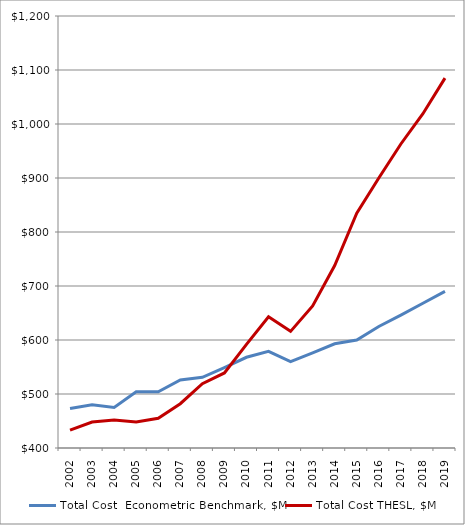
| Category | Total Cost  Econometric Benchmark, $M | Total Cost THESL, $M |
|---|---|---|
| 2002.0 | 473 | 433 |
| 2003.0 | 480 | 448 |
| 2004.0 | 475 | 452 |
| 2005.0 | 504 | 448 |
| 2006.0 | 504 | 455 |
| 2007.0 | 526 | 482 |
| 2008.0 | 531 | 519 |
| 2009.0 | 549 | 539 |
| 2010.0 | 568 | 592 |
| 2011.0 | 579 | 643 |
| 2012.0 | 560 | 616 |
| 2013.0 | 576 | 663 |
| 2014.0 | 593 | 738 |
| 2015.0 | 600 | 835 |
| 2016.0 | 625 | 900 |
| 2017.0 | 646 | 963 |
| 2018.0 | 668 | 1019 |
| 2019.0 | 690 | 1085 |